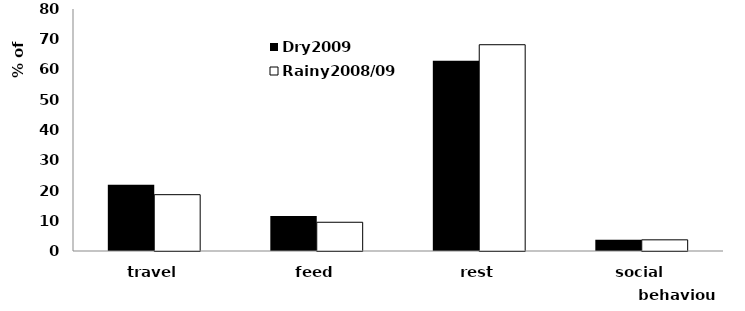
| Category | Dry2009 | Rainy2008/09 |
|---|---|---|
| travel | 21.87 | 18.62 |
| feed | 11.56 | 9.5 |
| rest | 62.86 | 68.19 |
| social | 3.71 | 3.69 |